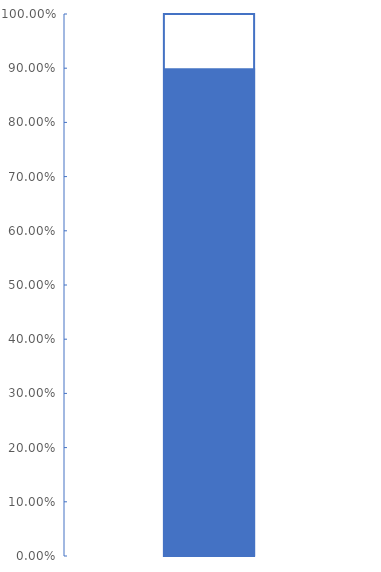
| Category | Achieved |
|---|---|
| 0 | 0.9 |